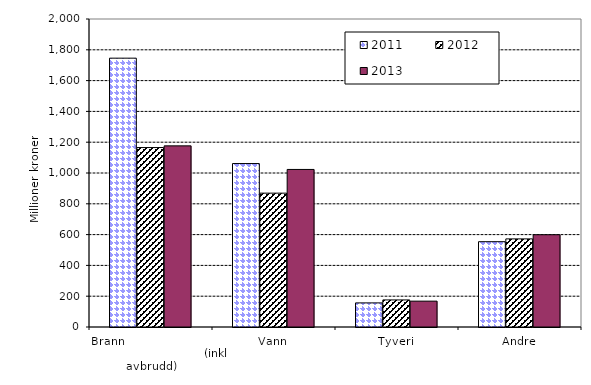
| Category | 2011 | 2012 | 2013 |
|---|---|---|---|
| Brann                                                       (inkl avbrudd) | 1745.7 | 1165.27 | 1176.18 |
| Vann | 1061.421 | 869.155 | 1023.081 |
| Tyveri | 156.469 | 175.738 | 167.848 |
| Andre | 554 | 572.176 | 599.198 |